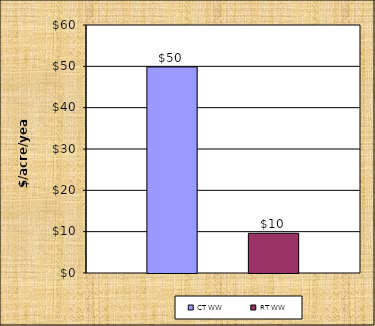
| Category | CT WW | RT WW |
|---|---|---|
| 0 | 49.86 | 9.608 |